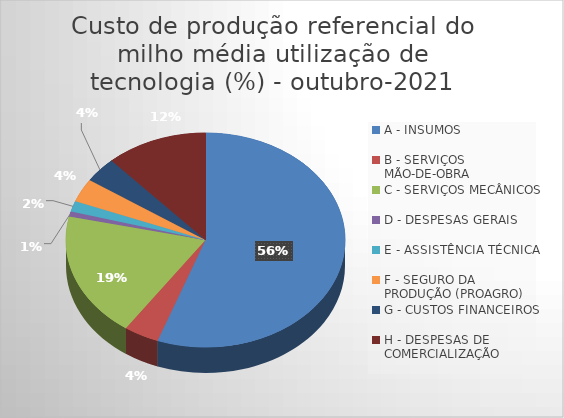
| Category | Series 0 |
|---|---|
| A - INSUMOS | 55.567 |
| B - SERVIÇOS MÃO-DE-OBRA | 4.074 |
| C - SERVIÇOS MECÂNICOS | 18.869 |
| D - DESPESAS GERAIS  | 0.785 |
| E - ASSISTÊNCIA TÉCNICA | 1.586 |
| F - SEGURO DA PRODUÇÃO (PROAGRO) | 3.568 |
| G - CUSTOS FINANCEIROS | 3.8 |
| H - DESPESAS DE COMERCIALIZAÇÃO | 11.75 |